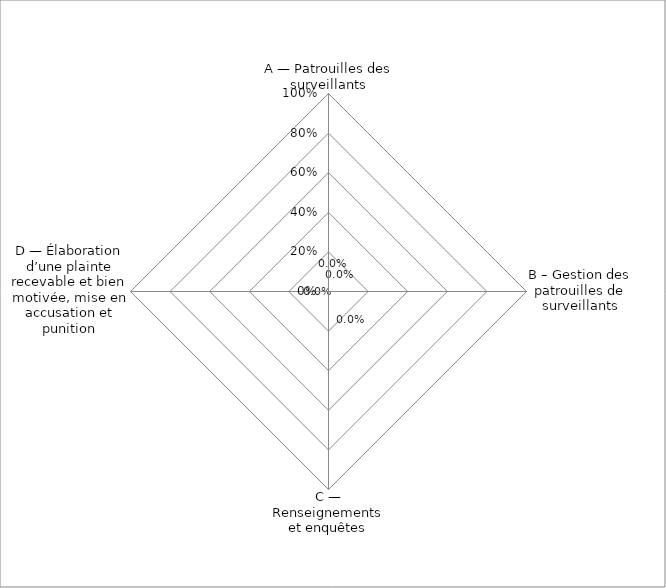
| Category | Series 0 |
|---|---|
| A — Patrouilles des surveillants | 0 |
| B – Gestion des patrouilles de surveillants | 0 |
| C — Renseignements et enquêtes | 0 |
| D — Élaboration d’une plainte recevable et bien motivée, mise en accusation et punition | 0 |